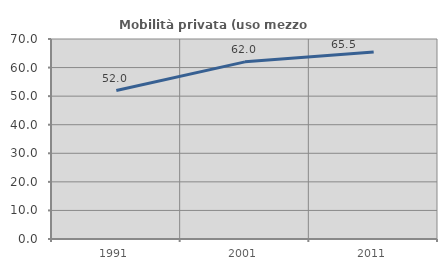
| Category | Mobilità privata (uso mezzo privato) |
|---|---|
| 1991.0 | 51.957 |
| 2001.0 | 62 |
| 2011.0 | 65.466 |